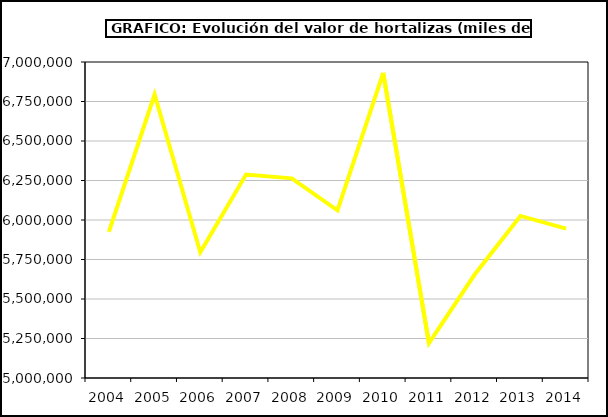
| Category | Valor |
|---|---|
| 2004.0 | 5925063.585 |
| 2005.0 | 6794137.546 |
| 2006.0 | 5796221.037 |
| 2007.0 | 6287554.895 |
| 2008.0 | 6263457.851 |
| 2009.0 | 6061506.811 |
| 2010.0 | 6931312.064 |
| 2011.0 | 5220724.649 |
| 2012.0 | 5654821.085 |
| 2013.0 | 6025736 |
| 2014.0 | 5945397.615 |